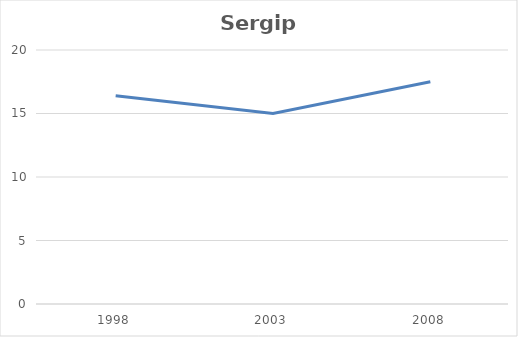
| Category | Sergipe |
|---|---|
| 1998.0 | 16.4 |
| 2003.0 | 15 |
| 2008.0 | 17.5 |